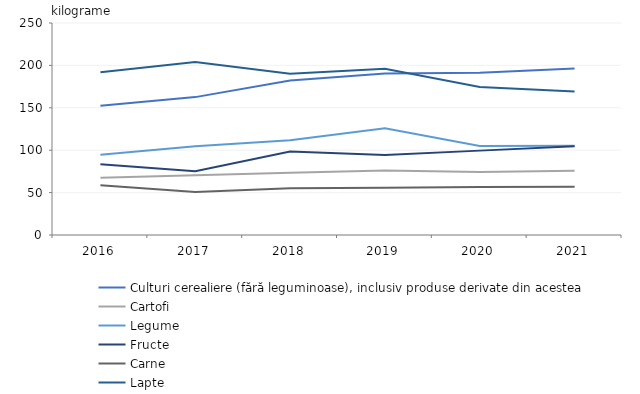
| Category | Culturi cerealiere (fără leguminoase), inclusiv produse derivate din acestea | Cartofi | Legume | Fructe | Carne | Lapte |
|---|---|---|---|---|---|---|
| 2016.0 | 152.3 | 67.6 | 94.7 | 83.5 | 58.6 | 191.9 |
| 2017.0 | 162.6 | 70.4 | 104.6 | 75.2 | 50.8 | 204 |
| 2018.0 | 182.2 | 73.4 | 111.6 | 98.5 | 55.2 | 190.2 |
| 2019.0 | 190.5 | 76 | 125.9 | 94.3 | 55.6 | 196.1 |
| 2020.0 | 191.2 | 74.2 | 105 | 99.5 | 56.5 | 174.6 |
| 2021.0 | 196.3 | 75.7 | 105.2 | 104.7 | 56.9 | 169.1 |